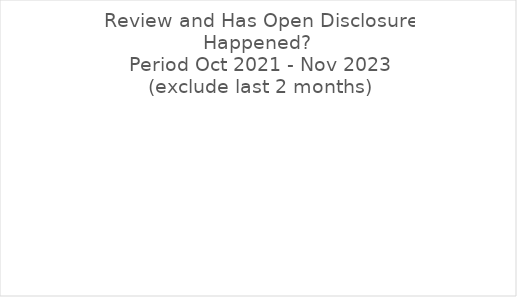
| Category | Yes |
|---|---|
| Yes | 0 |
| No | 0 |
| empty | 0 |